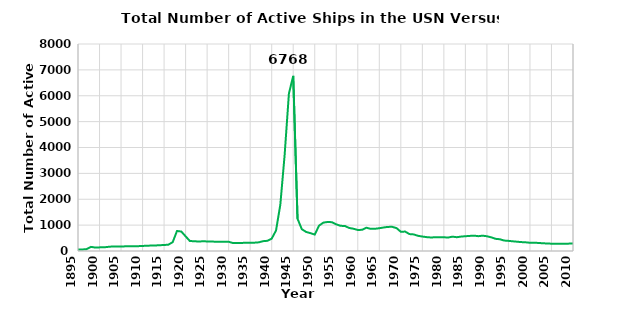
| Category | "Total Active USN Ships" |
|---|---|
| 1886.0 | 38 |
| 1887.0 | 39 |
| 1888.0 | 39 |
| 1889.0 | 43 |
| 1890.0 | 42 |
| 1891.0 | 46 |
| 1892.0 | 43 |
| 1893.0 | 43 |
| 1894.0 | 50 |
| 1895.0 | 55 |
| 1896.0 | 59 |
| 1897.0 | 72 |
| 1898.0 | 160 |
| 1899.0 | 133 |
| 1900.0 | 140 |
| 1901.0 | 141 |
| 1902.0 | 160 |
| 1903.0 | 175 |
| 1904.0 | 177 |
| 1905.0 | 174 |
| 1906.0 | 180 |
| 1907.0 | 180 |
| 1908.0 | 181 |
| 1909.0 | 187 |
| 1910.0 | 196 |
| 1911.0 | 202 |
| 1912.0 | 211 |
| 1913.0 | 214 |
| 1914.0 | 224 |
| 1915.0 | 231 |
| 1916.0 | 245 |
| 1917.0 | 342 |
| 1918.0 | 774 |
| 1919.0 | 752 |
| 1920.0 | 567 |
| 1921.0 | 384 |
| 1922.0 | 379 |
| 1923.0 | 365 |
| 1924.0 | 376 |
| 1925.0 | 370 |
| 1926.0 | 368 |
| 1927.0 | 357 |
| 1928.0 | 360 |
| 1929.0 | 356 |
| 1930.0 | 357 |
| 1931.0 | 308 |
| 1932.0 | 313 |
| 1933.0 | 311 |
| 1934.0 | 320 |
| 1935.0 | 320 |
| 1936.0 | 322 |
| 1937.0 | 335 |
| 1938.0 | 380 |
| 1939.0 | 394 |
| 1940.0 | 478 |
| 1941.0 | 790 |
| 1942.0 | 1782 |
| 1943.0 | 3699 |
| 1944.0 | 6084 |
| 1945.0 | 6768 |
| 1946.0 | 1248 |
| 1947.0 | 842 |
| 1948.0 | 737 |
| 1949.0 | 690 |
| 1950.0 | 634 |
| 1951.0 | 980 |
| 1952.0 | 1097 |
| 1953.0 | 1122 |
| 1954.0 | 1113 |
| 1955.0 | 1030 |
| 1956.0 | 973 |
| 1957.0 | 967 |
| 1958.0 | 890 |
| 1959.0 | 860 |
| 1960.0 | 812 |
| 1961.0 | 819 |
| 1962.0 | 900 |
| 1963.0 | 857 |
| 1964.0 | 859 |
| 1965.0 | 880 |
| 1966.0 | 909 |
| 1967.0 | 932 |
| 1968.0 | 933 |
| 1969.0 | 885 |
| 1970.0 | 743 |
| 1971.0 | 751 |
| 1972.0 | 654 |
| 1973.0 | 641 |
| 1974.0 | 587 |
| 1975.0 | 559 |
| 1976.0 | 536 |
| 1977.0 | 523 |
| 1978.0 | 531 |
| 1979.0 | 533 |
| 1980.0 | 530 |
| 1981.0 | 521 |
| 1982.0 | 555 |
| 1983.0 | 533 |
| 1984.0 | 557 |
| 1985.0 | 571 |
| 1986.0 | 583 |
| 1987.0 | 594 |
| 1988.0 | 573 |
| 1989.0 | 592 |
| 1990.0 | 570 |
| 1991.0 | 529 |
| 1992.0 | 471 |
| 1993.0 | 454 |
| 1994.0 | 404 |
| 1995.0 | 392 |
| 1996.0 | 375 |
| 1997.0 | 359 |
| 1998.0 | 344 |
| 1999.0 | 336 |
| 2000.0 | 318 |
| 2001.0 | 316 |
| 2002.0 | 313 |
| 2003.0 | 297 |
| 2004.0 | 292 |
| 2005.0 | 282 |
| 2006.0 | 281 |
| 2007.0 | 279 |
| 2008.0 | 282 |
| 2009.0 | 285 |
| 2010.0 | 288 |